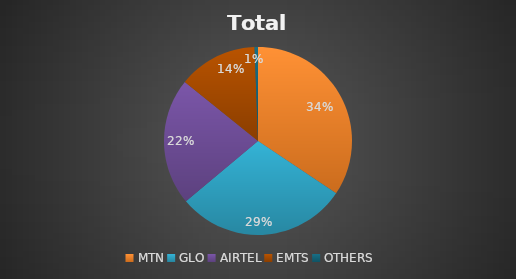
| Category | Total Internet |
|---|---|
| MTN | 31691070 |
| GLO | 27184002 |
| AIRTEL | 20174089 |
| EMTS | 12549596 |
| OTHERS | 537266 |